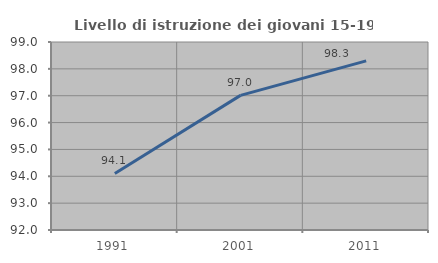
| Category | Livello di istruzione dei giovani 15-19 anni |
|---|---|
| 1991.0 | 94.106 |
| 2001.0 | 97.013 |
| 2011.0 | 98.295 |